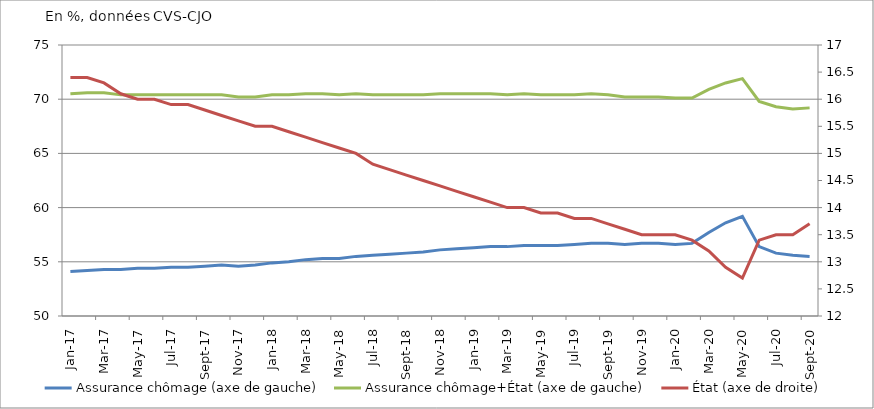
| Category | Assurance chômage (axe de gauche) | Assurance chômage+État (axe de gauche) |
|---|---|---|
| 2017-01-01 | 54.1 | 70.5 |
| 2017-02-01 | 54.2 | 70.6 |
| 2017-03-01 | 54.3 | 70.6 |
| 2017-04-01 | 54.3 | 70.4 |
| 2017-05-01 | 54.4 | 70.4 |
| 2017-06-01 | 54.4 | 70.4 |
| 2017-07-01 | 54.5 | 70.4 |
| 2017-08-01 | 54.5 | 70.4 |
| 2017-09-01 | 54.6 | 70.4 |
| 2017-10-01 | 54.7 | 70.4 |
| 2017-11-01 | 54.6 | 70.2 |
| 2017-12-01 | 54.7 | 70.2 |
| 2018-01-01 | 54.9 | 70.4 |
| 2018-02-01 | 55 | 70.4 |
| 2018-03-01 | 55.2 | 70.5 |
| 2018-04-01 | 55.3 | 70.5 |
| 2018-05-01 | 55.3 | 70.4 |
| 2018-06-01 | 55.5 | 70.5 |
| 2018-07-01 | 55.6 | 70.4 |
| 2018-08-01 | 55.7 | 70.4 |
| 2018-09-01 | 55.8 | 70.4 |
| 2018-10-01 | 55.9 | 70.4 |
| 2018-11-01 | 56.1 | 70.5 |
| 2018-12-01 | 56.2 | 70.5 |
| 2019-01-01 | 56.3 | 70.5 |
| 2019-02-01 | 56.4 | 70.5 |
| 2019-03-01 | 56.4 | 70.4 |
| 2019-04-01 | 56.5 | 70.5 |
| 2019-05-01 | 56.5 | 70.4 |
| 2019-06-01 | 56.5 | 70.4 |
| 2019-07-01 | 56.6 | 70.4 |
| 2019-08-01 | 56.7 | 70.5 |
| 2019-09-01 | 56.7 | 70.4 |
| 2019-10-01 | 56.6 | 70.2 |
| 2019-11-01 | 56.7 | 70.2 |
| 2019-12-01 | 56.7 | 70.2 |
| 2020-01-01 | 56.6 | 70.1 |
| 2020-02-01 | 56.7 | 70.1 |
| 2020-03-01 | 57.7 | 70.9 |
| 2020-04-01 | 58.6 | 71.5 |
| 2020-05-01 | 59.2 | 71.9 |
| 2020-06-01 | 56.4 | 69.8 |
| 2020-07-01 | 55.8 | 69.3 |
| 2020-08-01 | 55.6 | 69.1 |
| 2020-09-01 | 55.5 | 69.2 |